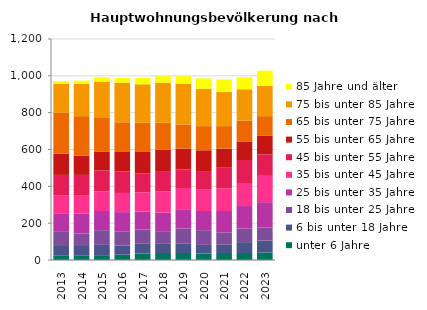
| Category | unter 6 Jahre | 6 bis unter 18 Jahre | 18 bis unter 25 Jahre | 25 bis unter 35 Jahre | 35 bis unter 45 Jahre | 45 bis unter 55 Jahre | 55 bis unter 65 Jahre | 65 bis unter 75 Jahre | 75 bis unter 85 Jahre | 85 Jahre und älter |
|---|---|---|---|---|---|---|---|---|---|---|
| 2013.0 | 23 | 53 | 77 | 101 | 98 | 110 | 116 | 221 | 158 | 14 |
| 2014.0 | 23 | 53 | 68 | 107 | 98 | 113 | 104 | 215 | 176 | 17 |
| 2015.0 | 26 | 56 | 80 | 104 | 107 | 113 | 101 | 188 | 194 | 23 |
| 2016.0 | 29 | 50 | 77 | 104 | 104 | 116 | 110 | 158 | 215 | 26 |
| 2017.0 | 35 | 53 | 77 | 98 | 104 | 104 | 119 | 155 | 209 | 35 |
| 2018.0 | 38 | 53 | 62 | 104 | 116 | 110 | 116 | 146 | 218 | 35 |
| 2019.0 | 38 | 50 | 83 | 101 | 119 | 101 | 113 | 131 | 221 | 41 |
| 2020.0 | 35 | 47 | 80 | 104 | 119 | 98 | 113 | 131 | 203 | 56 |
| 2021.0 | 38 | 47 | 65 | 116 | 122 | 113 | 104 | 122 | 185 | 68 |
| 2022.0 | 38 | 59 | 74 | 122 | 125 | 125 | 101 | 113 | 170 | 65 |
| 2023.0 | 41 | 65 | 71 | 137 | 143 | 116 | 101 | 107 | 164 | 83 |